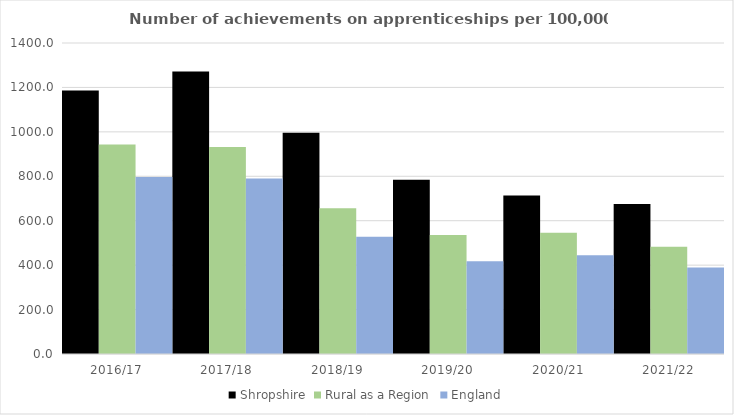
| Category | Shropshire | Rural as a Region | England |
|---|---|---|---|
| 2016/17 | 1186 | 942.594 | 797 |
| 2017/18 | 1272 | 931.709 | 790 |
| 2018/19 | 996 | 656.44 | 528 |
| 2019/20 | 784 | 535.552 | 418 |
| 2020/21 | 713 | 545.333 | 444 |
| 2021/22 | 675 | 482.936 | 389 |